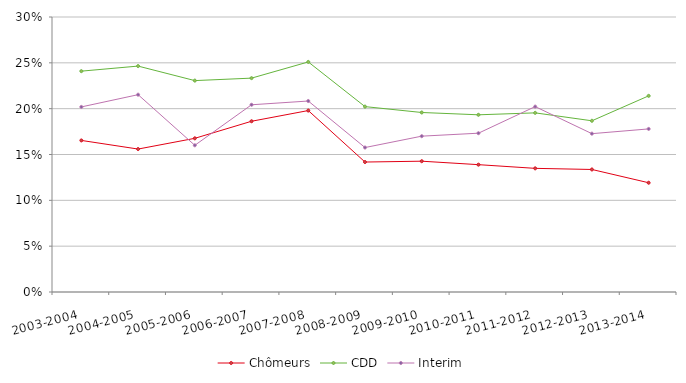
| Category | Chômeurs | CDD | Interim |
|---|---|---|---|
| 2003-2004 | 0.165 | 0.241 | 0.202 |
| 2004-2005 | 0.156 | 0.246 | 0.215 |
| 2005-2006 | 0.168 | 0.231 | 0.16 |
| 2006-2007 | 0.186 | 0.233 | 0.204 |
| 2007-2008 | 0.198 | 0.251 | 0.208 |
| 2008-2009 | 0.142 | 0.202 | 0.158 |
| 2009-2010 | 0.143 | 0.196 | 0.17 |
| 2010-2011 | 0.139 | 0.193 | 0.173 |
| 2011-2012 | 0.135 | 0.195 | 0.202 |
| 2012-2013 | 0.134 | 0.187 | 0.173 |
| 2013-2014 | 0.119 | 0.214 | 0.178 |